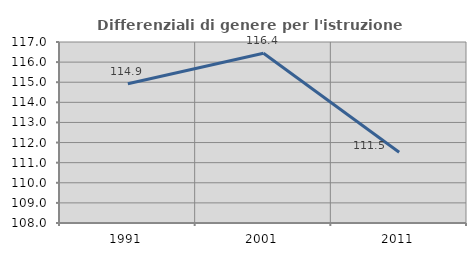
| Category | Differenziali di genere per l'istruzione superiore |
|---|---|
| 1991.0 | 114.92 |
| 2001.0 | 116.441 |
| 2011.0 | 111.52 |